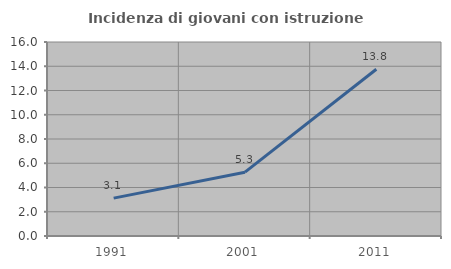
| Category | Incidenza di giovani con istruzione universitaria |
|---|---|
| 1991.0 | 3.125 |
| 2001.0 | 5.263 |
| 2011.0 | 13.75 |